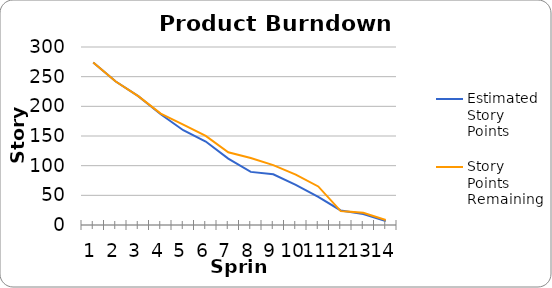
| Category | Estimated Story Points | Story Points Remaining |
|---|---|---|
| 0 | 273.75 | 273.75 |
| 1 | 241.75 | 241.75 |
| 2 | 217.25 | 217.25 |
| 3 | 186.75 | 187.75 |
| 4 | 159.75 | 169.25 |
| 5 | 140.75 | 150.25 |
| 6 | 112 | 122.5 |
| 7 | 89.5 | 113 |
| 8 | 85.5 | 101 |
| 9 | 67.5 | 85 |
| 10 | 47.5 | 65 |
| 11 | 24.5 | 23.5 |
| 12 | 18.5 | 20.5 |
| 13 | 6.5 | 8.5 |